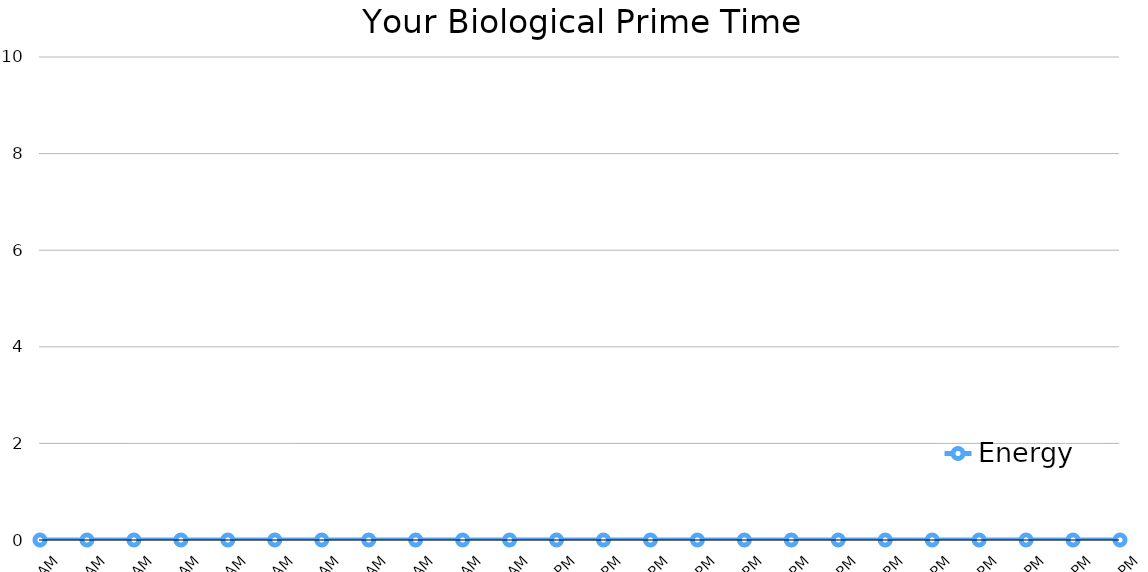
| Category | Energy |
|---|---|
| 1:00 AM | 0 |
| 2:00 AM | 0 |
| 3:00 AM | 0 |
| 4:00 AM | 0 |
| 5:00 AM | 0 |
| 6:00 AM | 0 |
| 7:00 AM | 0 |
| 8:00 AM | 0 |
| 9:00 AM | 0 |
| 10:00 AM | 0 |
| 11:00 AM | 0 |
| 12:00 PM | 0 |
| 1:00 PM | 0 |
| 2:00 PM | 0 |
| 3:00 PM | 0 |
| 4:00 PM | 0 |
| 5:00 PM | 0 |
| 6:00 PM | 0 |
| 7:00 PM | 0 |
| 8:00 PM | 0 |
| 9:00 PM | 0 |
| 10:00 PM | 0 |
| 11:00 PM | 0 |
| 12:00 PM | 0 |